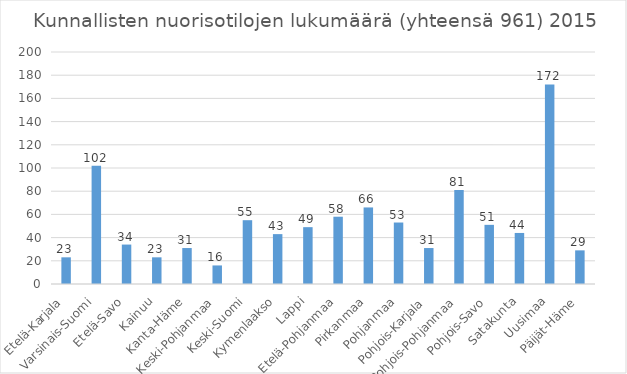
| Category | Kunnallisten nuorisotilojen lukumäärä |
|---|---|
| Etelä-Karjala | 23 |
| Varsinais-Suomi | 102 |
| Etelä-Savo | 34 |
| Kainuu | 23 |
| Kanta-Häme | 31 |
| Keski-Pohjanmaa | 16 |
| Keski-Suomi | 55 |
| Kymenlaakso | 43 |
| Lappi | 49 |
| Etelä-Pohjanmaa | 58 |
| Pirkanmaa | 66 |
| Pohjanmaa | 53 |
| Pohjois-Karjala | 31 |
| Pohjois-Pohjanmaa | 81 |
| Pohjois-Savo | 51 |
| Satakunta | 44 |
| Uusimaa | 172 |
| Päijät-Häme | 29 |